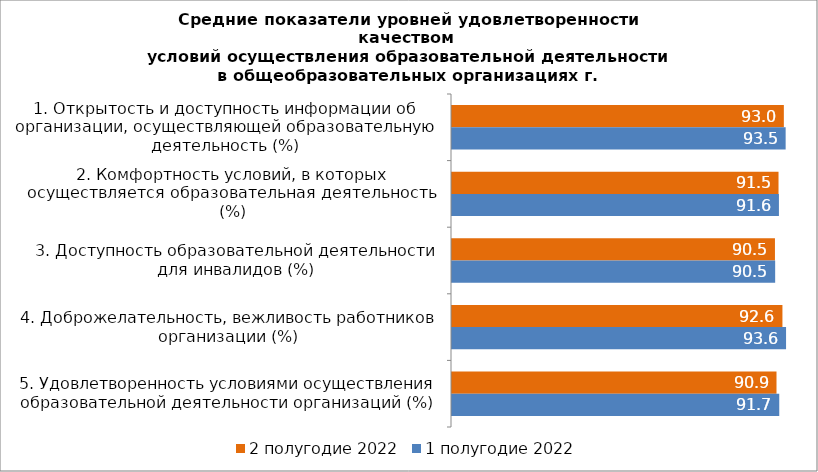
| Category | 2 полугодие 2022 | 1 полугодие 2022 |
|---|---|---|
| 1. Открытость и доступность информации об организации, осуществляющей образовательную деятельность (%) | 92.955 | 93.458 |
| 2. Комфортность условий, в которых осуществляется образовательная деятельность (%) | 91.462 | 91.577 |
| 3. Доступность образовательной деятельности для инвалидов (%) | 90.464 | 90.522 |
| 4. Доброжелательность, вежливость работников организации (%) | 92.559 | 93.573 |
| 5. Удовлетворенность условиями осуществления образовательной деятельности организаций (%) | 90.898 | 91.668 |